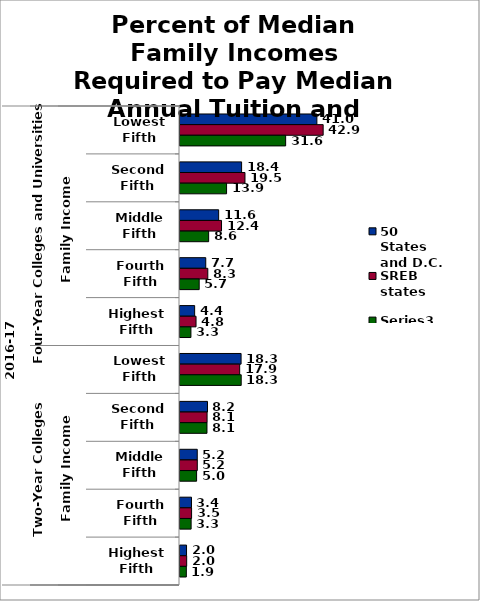
| Category | 50 States and D.C. | SREB states | Series 2 |
|---|---|---|---|
| 0 | 40.982 | 42.863 | 31.632 |
| 1 | 18.442 | 19.454 | 13.942 |
| 2 | 11.576 | 12.434 | 8.58 |
| 3 | 7.713 | 8.324 | 5.749 |
| 4 | 4.386 | 4.802 | 3.273 |
| 5 | 18.291 | 17.866 | 18.327 |
| 6 | 8.231 | 8.109 | 8.077 |
| 7 | 5.166 | 5.183 | 4.971 |
| 8 | 3.443 | 3.47 | 3.331 |
| 9 | 1.958 | 2.001 | 1.896 |